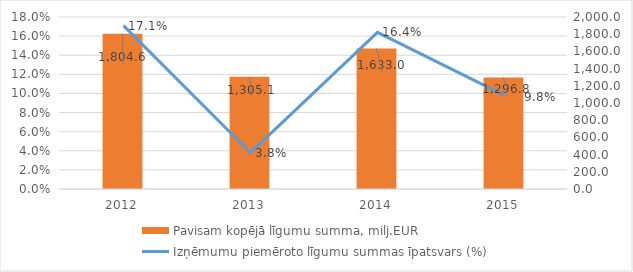
| Category | Pavisam kopējā līgumu summa, milj.EUR |
|---|---|
| 2012.0 | 1804.591 |
| 2013.0 | 1305.116 |
| 2014.0 | 1632.977 |
| 2015.0 | 1296.767 |